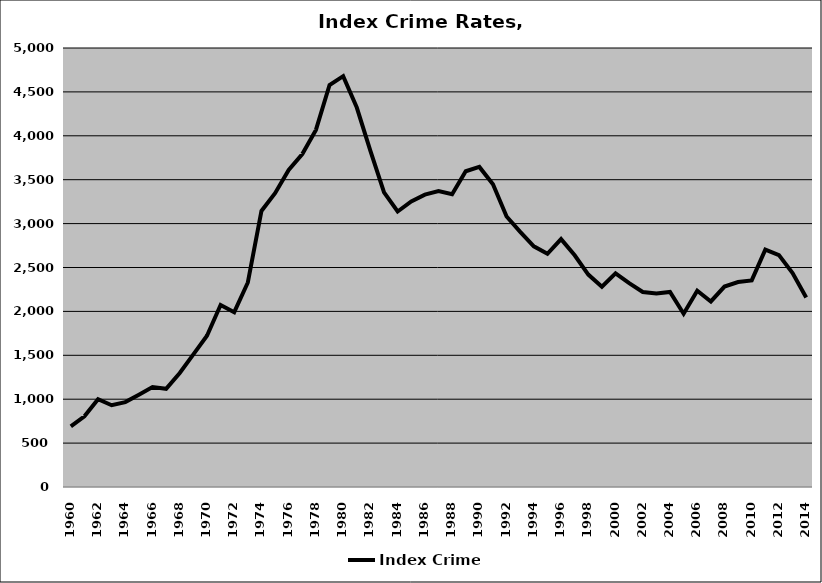
| Category | Index Crime |
|---|---|
| 1960.0 | 689.711 |
| 1961.0 | 805.314 |
| 1962.0 | 999.684 |
| 1963.0 | 931.419 |
| 1964.0 | 966.667 |
| 1965.0 | 1051.719 |
| 1966.0 | 1138.032 |
| 1967.0 | 1118.513 |
| 1968.0 | 1297.863 |
| 1969.0 | 1510.6 |
| 1970.0 | 1722.154 |
| 1971.0 | 2073.228 |
| 1972.0 | 1991.18 |
| 1973.0 | 2329.33 |
| 1974.0 | 3143.936 |
| 1975.0 | 3346.577 |
| 1976.0 | 3611.314 |
| 1977.0 | 3792.108 |
| 1978.0 | 4067.509 |
| 1979.0 | 4578.805 |
| 1980.0 | 4679.615 |
| 1981.0 | 4321.818 |
| 1982.0 | 3829.232 |
| 1983.0 | 3356.309 |
| 1984.0 | 3137.666 |
| 1985.0 | 3251.904 |
| 1986.0 | 3330.088 |
| 1987.0 | 3371.712 |
| 1988.0 | 3333.911 |
| 1989.0 | 3596.206 |
| 1990.0 | 3645.249 |
| 1991.0 | 3447.783 |
| 1992.0 | 3080.558 |
| 1993.0 | 2904.978 |
| 1994.0 | 2740.985 |
| 1995.0 | 2655.401 |
| 1996.0 | 2823.494 |
| 1997.0 | 2639.642 |
| 1998.0 | 2419.831 |
| 1999.0 | 2281.677 |
| 2000.0 | 2433.107 |
| 2001.0 | 2321.26 |
| 2002.0 | 2221.115 |
| 2003.0 | 2203.22 |
| 2004.0 | 2221.42 |
| 2005.0 | 1973.647 |
| 2006.0 | 2235.388 |
| 2007.0 | 2113.118 |
| 2008.0 | 2283.201 |
| 2009.0 | 2333.956 |
| 2010.0 | 2353.263 |
| 2011.0 | 2702.975 |
| 2012.0 | 2641.84 |
| 2013.0 | 2436.837 |
| 2014.0 | 2158.782 |